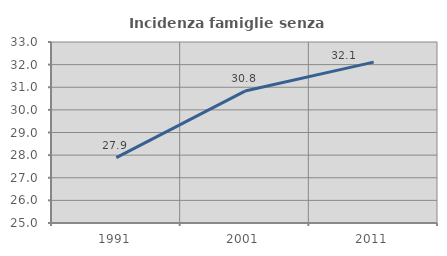
| Category | Incidenza famiglie senza nuclei |
|---|---|
| 1991.0 | 27.886 |
| 2001.0 | 30.832 |
| 2011.0 | 32.11 |